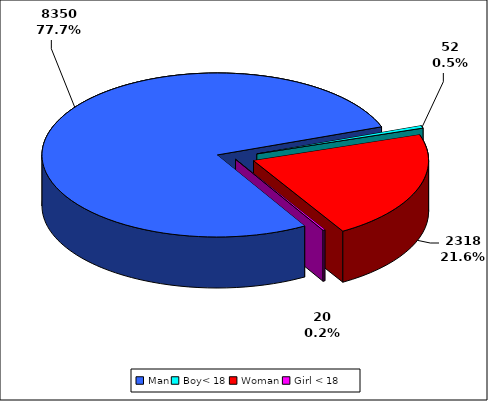
| Category | TOTAL |
|---|---|
| Man | 8350 |
| Boy< 18 | 52 |
| Woman | 2318 |
| Girl < 18 | 20 |